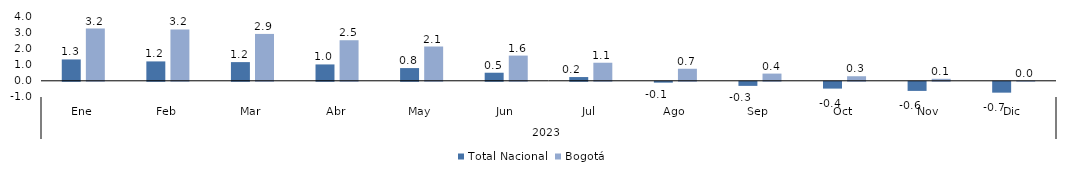
| Category | Total Nacional | Bogotá |
|---|---|---|
| 0 | 1.319 | 3.225 |
| 1 | 1.197 | 3.168 |
| 2 | 1.153 | 2.894 |
| 3 | 1.01 | 2.504 |
| 4 | 0.785 | 2.117 |
| 5 | 0.498 | 1.556 |
| 6 | 0.231 | 1.115 |
| 7 | -0.053 | 0.743 |
| 8 | -0.252 | 0.444 |
| 9 | -0.42 | 0.282 |
| 10 | -0.562 | 0.123 |
| 11 | -0.67 | 0.014 |